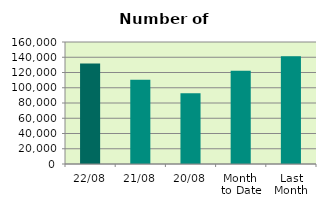
| Category | Series 0 |
|---|---|
| 22/08 | 131676 |
| 21/08 | 110482 |
| 20/08 | 92712 |
| Month 
to Date | 122454.75 |
| Last
Month | 141432.273 |